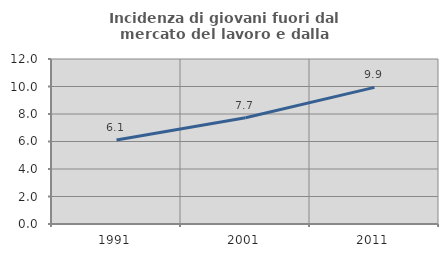
| Category | Incidenza di giovani fuori dal mercato del lavoro e dalla formazione  |
|---|---|
| 1991.0 | 6.114 |
| 2001.0 | 7.732 |
| 2011.0 | 9.938 |